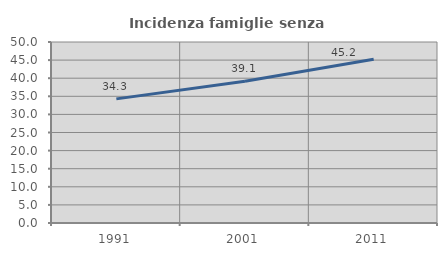
| Category | Incidenza famiglie senza nuclei |
|---|---|
| 1991.0 | 34.286 |
| 2001.0 | 39.13 |
| 2011.0 | 45.223 |